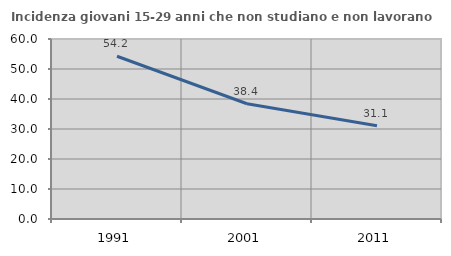
| Category | Incidenza giovani 15-29 anni che non studiano e non lavorano  |
|---|---|
| 1991.0 | 54.242 |
| 2001.0 | 38.413 |
| 2011.0 | 31.053 |